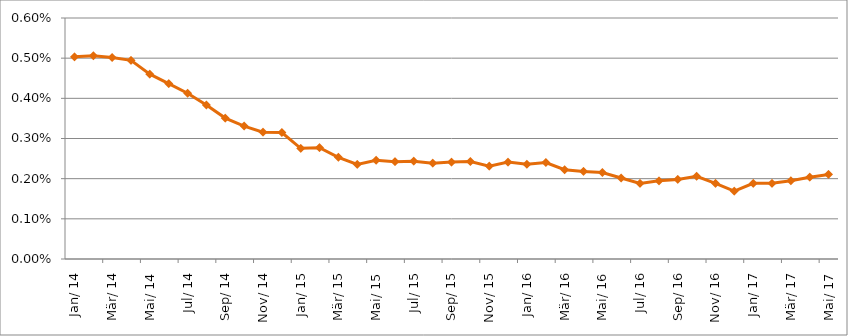
| Category | Durchschnittszins |
|---|---|
| 2014-01-01 | 0.005 |
| 2014-02-01 | 0.005 |
| 2014-03-01 | 0.005 |
| 2014-04-01 | 0.005 |
| 2014-05-01 | 0.005 |
| 2014-06-01 | 0.004 |
| 2014-07-01 | 0.004 |
| 2014-08-01 | 0.004 |
| 2014-09-01 | 0.004 |
| 2014-10-01 | 0.003 |
| 2014-11-01 | 0.003 |
| 2014-12-01 | 0.003 |
| 2015-01-01 | 0.003 |
| 2015-02-01 | 0.003 |
| 2015-03-01 | 0.003 |
| 2015-04-01 | 0.002 |
| 2015-05-01 | 0.002 |
| 2015-06-01 | 0.002 |
| 2015-07-01 | 0.002 |
| 2015-08-01 | 0.002 |
| 2015-09-01 | 0.002 |
| 2015-10-01 | 0.002 |
| 2015-11-01 | 0.002 |
| 2015-12-01 | 0.002 |
| 2016-01-01 | 0.002 |
| 2016-02-01 | 0.002 |
| 2016-03-01 | 0.002 |
| 2016-04-01 | 0.002 |
| 2016-05-01 | 0.002 |
| 2016-06-01 | 0.002 |
| 2016-07-01 | 0.002 |
| 2016-08-01 | 0.002 |
| 2016-09-01 | 0.002 |
| 2016-10-01 | 0.002 |
| 2016-11-01 | 0.002 |
| 2016-12-01 | 0.002 |
| 2017-01-01 | 0.002 |
| 2017-02-01 | 0.002 |
| 2017-03-01 | 0.002 |
| 2017-04-01 | 0.002 |
| 2017-05-01 | 0.002 |